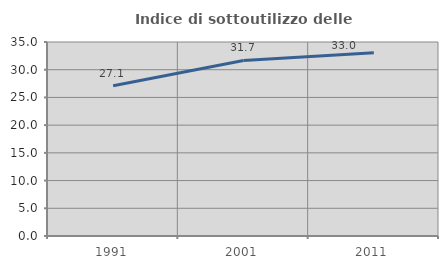
| Category | Indice di sottoutilizzo delle abitazioni  |
|---|---|
| 1991.0 | 27.112 |
| 2001.0 | 31.664 |
| 2011.0 | 33.039 |